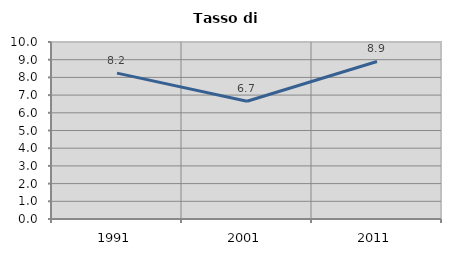
| Category | Tasso di disoccupazione   |
|---|---|
| 1991.0 | 8.242 |
| 2001.0 | 6.656 |
| 2011.0 | 8.902 |